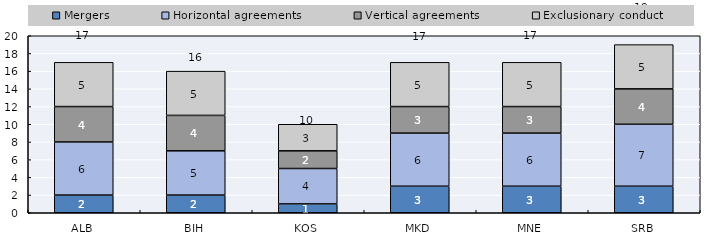
| Category | Mergers | Horizontal agreements | Vertical agreements | Exclusionary conduct | Total |
|---|---|---|---|---|---|
| ALB | 2 | 6 | 4 | 5 | 17 |
| BIH | 2 | 5 | 4 | 5 | 16 |
| KOS | 1 | 4 | 2 | 3 | 10 |
| MKD | 3 | 6 | 3 | 5 | 17 |
| MNE | 3 | 6 | 3 | 5 | 17 |
| SRB | 3 | 7 | 4 | 5 | 19 |